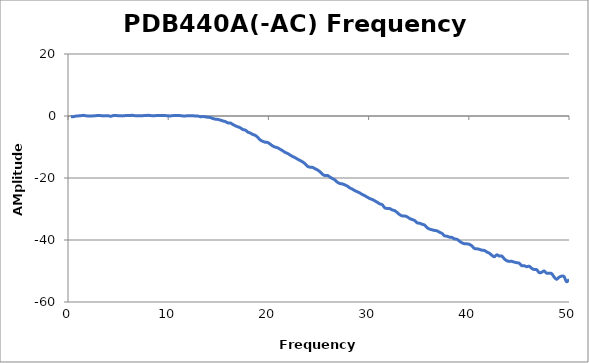
| Category | Series 0 |
|---|---|
| 0.3 | -0.289 |
| 0.5485 | -0.194 |
| 0.797 | -0.031 |
| 1.0455 | 0.044 |
| 1.294 | 0.112 |
| 1.5425 | 0.207 |
| 1.791 | 0.069 |
| 2.0395 | -0.01 |
| 2.288 | -0.009 |
| 2.5365 | 0.04 |
| 2.785 | 0.1 |
| 3.0335 | 0.184 |
| 3.282 | 0.115 |
| 3.5305 | 0.042 |
| 3.779 | 0.051 |
| 4.0275 | 0.072 |
| 4.276 | -0.103 |
| 4.5245 | 0.158 |
| 4.773 | 0.139 |
| 5.0215 | 0.107 |
| 5.27 | 0.061 |
| 5.5185 | 0.042 |
| 5.767 | 0.152 |
| 6.0155 | 0.145 |
| 6.264 | 0.202 |
| 6.5125 | 0.197 |
| 6.761 | 0.054 |
| 7.0095 | 0.066 |
| 7.258 | 0.112 |
| 7.5065 | 0.119 |
| 7.755 | 0.151 |
| 8.0035 | 0.22 |
| 8.252 | 0.141 |
| 8.5005 | 0.065 |
| 8.749 | 0.128 |
| 8.9975 | 0.168 |
| 9.246 | 0.174 |
| 9.4945 | 0.197 |
| 9.743 | 0.133 |
| 9.9915 | 0.051 |
| 10.24 | 0.039 |
| 10.4885 | 0.133 |
| 10.737 | 0.19 |
| 10.9855 | 0.192 |
| 11.234 | 0.112 |
| 11.4825 | 0.026 |
| 11.731 | 0.028 |
| 11.9795 | 0.08 |
| 12.228 | 0.102 |
| 12.4765 | 0.082 |
| 12.725 | -0.007 |
| 12.9735 | -0.035 |
| 13.222 | -0.229 |
| 13.4705 | -0.178 |
| 13.719 | -0.284 |
| 13.9675 | -0.396 |
| 14.216 | -0.501 |
| 14.4645 | -0.817 |
| 14.713 | -1.015 |
| 14.9615 | -1.105 |
| 15.21 | -1.327 |
| 15.4585 | -1.587 |
| 15.707 | -1.812 |
| 15.9555 | -2.222 |
| 16.204 | -2.269 |
| 16.4525 | -2.726 |
| 16.701 | -3.167 |
| 16.9495 | -3.491 |
| 17.198 | -3.802 |
| 17.4465 | -4.355 |
| 17.695 | -4.55 |
| 17.9435 | -5.177 |
| 18.192 | -5.498 |
| 18.4405 | -5.951 |
| 18.689 | -6.24 |
| 18.9375 | -6.89 |
| 19.186 | -7.74 |
| 19.4345 | -8.158 |
| 19.683 | -8.442 |
| 19.9315 | -8.541 |
| 20.18 | -9.078 |
| 20.4285 | -9.667 |
| 20.677 | -10.037 |
| 20.9255 | -10.27 |
| 21.174 | -10.733 |
| 21.4225 | -11.205 |
| 21.671 | -11.738 |
| 21.9195 | -12.085 |
| 22.168 | -12.592 |
| 22.4165 | -13.08 |
| 22.665 | -13.442 |
| 22.9135 | -13.927 |
| 23.162 | -14.335 |
| 23.4105 | -14.796 |
| 23.659 | -15.391 |
| 23.9075 | -16.23 |
| 24.156 | -16.51 |
| 24.4045 | -16.579 |
| 24.653 | -17 |
| 24.9015 | -17.413 |
| 25.15 | -17.988 |
| 25.3985 | -18.81 |
| 25.647 | -19.207 |
| 25.8955 | -19.173 |
| 26.144 | -19.704 |
| 26.3925 | -20.174 |
| 26.641 | -20.636 |
| 26.8895 | -21.372 |
| 27.138 | -21.775 |
| 27.3865 | -21.907 |
| 27.635 | -22.229 |
| 27.8835 | -22.612 |
| 28.132 | -23.204 |
| 28.3805 | -23.604 |
| 28.629 | -24.066 |
| 28.8775 | -24.453 |
| 29.126 | -24.832 |
| 29.3745 | -25.329 |
| 29.623 | -25.718 |
| 29.8715 | -26.191 |
| 30.12 | -26.635 |
| 30.3685 | -26.93 |
| 30.617 | -27.368 |
| 30.8655 | -27.828 |
| 31.114 | -28.336 |
| 31.3625 | -28.633 |
| 31.611 | -29.613 |
| 31.8595 | -29.828 |
| 32.108 | -29.861 |
| 32.3565 | -30.304 |
| 32.605 | -30.534 |
| 32.8535 | -31.14 |
| 33.102 | -31.828 |
| 33.3505 | -32.208 |
| 33.599 | -32.237 |
| 33.8475 | -32.519 |
| 34.096 | -33.055 |
| 34.3445 | -33.399 |
| 34.593 | -33.715 |
| 34.8415 | -34.45 |
| 35.09 | -34.603 |
| 35.3385 | -34.908 |
| 35.587 | -35.194 |
| 35.8355 | -36.015 |
| 36.084 | -36.476 |
| 36.3325 | -36.714 |
| 36.581 | -36.908 |
| 36.8295 | -37.06 |
| 37.078 | -37.5 |
| 37.3265 | -37.874 |
| 37.575 | -38.642 |
| 37.8235 | -38.783 |
| 38.072 | -39.079 |
| 38.3205 | -39.165 |
| 38.569 | -39.666 |
| 38.8175 | -39.765 |
| 39.066 | -40.375 |
| 39.3145 | -40.894 |
| 39.563 | -41.209 |
| 39.8115 | -41.242 |
| 40.06 | -41.397 |
| 40.3085 | -41.914 |
| 40.557 | -42.729 |
| 40.8055 | -42.837 |
| 41.054 | -43.004 |
| 41.3025 | -43.292 |
| 41.551 | -43.383 |
| 41.7995 | -43.862 |
| 42.048 | -44.254 |
| 42.2965 | -44.914 |
| 42.545 | -45.411 |
| 42.7935 | -44.772 |
| 43.042 | -45.186 |
| 43.2905 | -45.164 |
| 43.539 | -46.075 |
| 43.7875 | -46.681 |
| 44.036 | -46.896 |
| 44.2845 | -46.873 |
| 44.533 | -47.13 |
| 44.7815 | -47.318 |
| 45.03 | -47.475 |
| 45.2785 | -48.279 |
| 45.527 | -48.28 |
| 45.7755 | -48.624 |
| 46.024 | -48.452 |
| 46.2725 | -49.134 |
| 46.521 | -49.537 |
| 46.7695 | -49.57 |
| 47.018 | -50.502 |
| 47.2665 | -50.424 |
| 47.515 | -49.98 |
| 47.7635 | -50.695 |
| 48.012 | -50.744 |
| 48.2605 | -50.813 |
| 48.509 | -51.938 |
| 48.7575 | -52.682 |
| 49.006 | -52.014 |
| 49.2545 | -51.68 |
| 49.503 | -51.781 |
| 49.7515 | -53.464 |
| 50.0 | -52.738 |